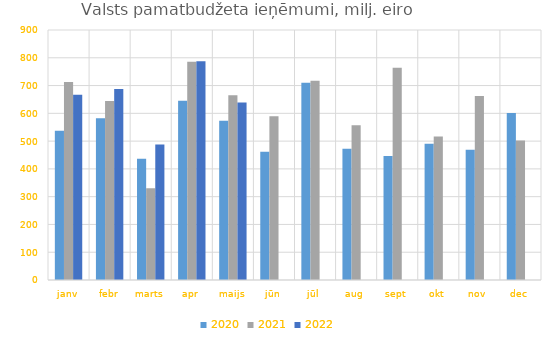
| Category | 2020 | 2021 | 2022 |
|---|---|---|---|
| janv | 537722.948 | 713014.632 | 666661.352 |
| febr | 582097.989 | 644814.957 | 687779.931 |
| marts | 436083.224 | 330339.758 | 487592.334 |
| apr | 645256.276 | 785719.324 | 787062.79 |
| maijs | 572854.69 | 665234.221 | 639232.675 |
| jūn | 461405.873 | 589166.177 | 0 |
| jūl | 709928.085 | 717458.088 | 0 |
| aug | 472605.695 | 557138.062 | 0 |
| sept | 446749.915 | 764496.897 | 0 |
| okt | 490335.515 | 516906.965 | 0 |
| nov | 468560.222 | 662718.632 | 0 |
| dec | 601482.069 | 502474.488 | 0 |